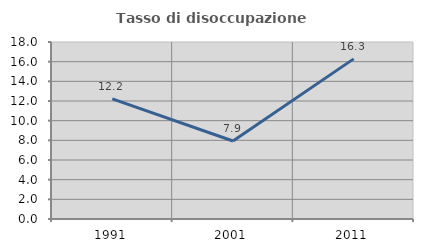
| Category | Tasso di disoccupazione giovanile  |
|---|---|
| 1991.0 | 12.22 |
| 2001.0 | 7.934 |
| 2011.0 | 16.284 |